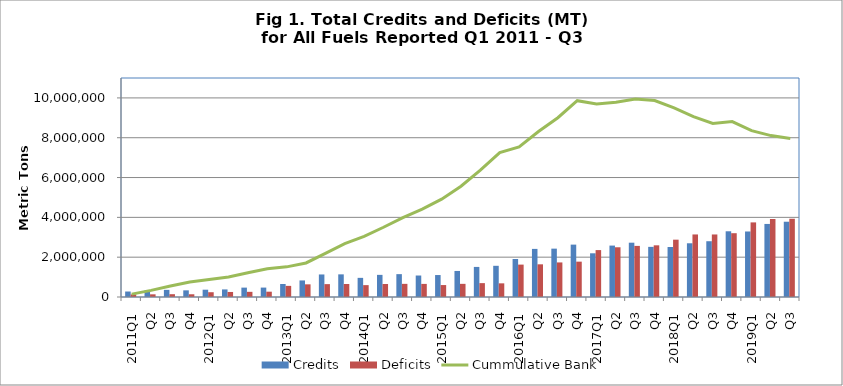
| Category | Credits | Deficits |
|---|---|---|
| 2011Q1 | 275639 | 132283 |
| Q2 | 325071 | 134760 |
| Q3 | 358817 | 141381 |
| Q4 | 334451 | 137396 |
| 2012Q1 | 366391 | 240260 |
| Q2 | 380783 | 252750 |
| Q3 | 471290 | 259582 |
| Q4 | 473045 | 266666 |
| 2013Q1 | 652535 | 558804 |
| Q2 | 832199 | 636140 |
| Q3 | 1132141 | 646613 |
| Q4 | 1137322 | 653565 |
| 2014Q1 | 961263 | 596240 |
| Q2 | 1111616 | 653122 |
| Q3 | 1148264 | 660254 |
| Q4 | 1079148 | 657732 |
| 2015Q1 | 1102964 | 600144 |
| Q2 | 1307728 | 660642 |
| Q3 | 1510776 | 696772 |
| Q4 | 1566956 | 686210 |
| 2016Q1 | 1907953 | 1627195 |
| Q2 | 2416181 | 1641557 |
| Q3 | 2428897 | 1736480 |
| Q4 | 2631117 | 1775489 |
| 2017Q1 | 2195244 | 2356219 |
| Q2 | 2582576 | 2497783 |
| Q3 | 2727782 | 2566731 |
| Q4 | 2518172 | 2595941 |
| 2018Q1 | 2510704 | 2879229 |
| Q2 | 2698444 | 3141737 |
| Q3 | 2801591 | 3140867 |
| Q4 | 3300987 | 3204670 |
| 2019Q1 | 3290850 | 3747363 |
| Q2 | 3669456 | 3918299 |
| Q3 | 3781221 | 3930334 |